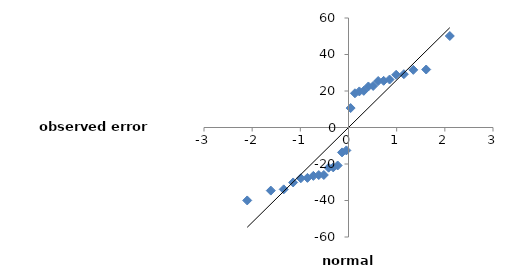
| Category | ei |
|---|---|
| -2.1029298595768426 | -39.971 |
| -1.6129388152332291 | -34.571 |
| -1.3451384553636758 | -33.896 |
| -1.1492082681575793 | -30.109 |
| -0.9897562448052486 | -27.821 |
| -0.8523706188755832 | -27.596 |
| -0.7296451195905346 | -26.509 |
| -0.6172122307178226 | -26.059 |
| -0.5122405620309701 | -26.021 |
| -0.4127566090253984 | -22.009 |
| -0.3172988787259257 | -21.859 |
| -0.22472407885547394 | -20.809 |
| -0.1340892990418859 | -13.646 |
| -0.04457435360165395 | -12.559 |
| 0.044574353601654494 | 10.654 |
| 0.13408929904188646 | 18.754 |
| 0.22472407885547394 | 19.766 |
| 0.3172988787259257 | 20.079 |
| 0.4127566090253984 | 22.479 |
| 0.5122405620309696 | 22.779 |
| 0.6172122307178226 | 25.479 |
| 0.7296451195905346 | 25.579 |
| 0.8523706188755832 | 26.279 |
| 0.9897562448052486 | 28.879 |
| 1.1492082681575793 | 29.216 |
| 1.3451384553636758 | 31.579 |
| 1.6129388152332291 | 31.779 |
| 2.102929859576842 | 50.141 |